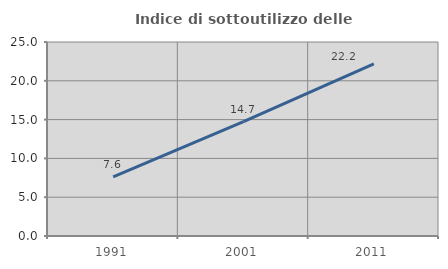
| Category | Indice di sottoutilizzo delle abitazioni  |
|---|---|
| 1991.0 | 7.629 |
| 2001.0 | 14.727 |
| 2011.0 | 22.169 |